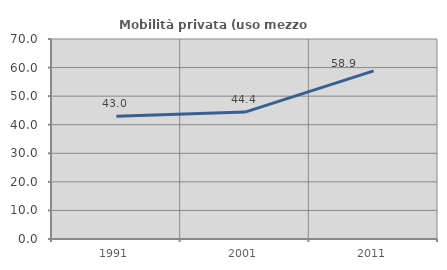
| Category | Mobilità privata (uso mezzo privato) |
|---|---|
| 1991.0 | 42.958 |
| 2001.0 | 44.412 |
| 2011.0 | 58.857 |